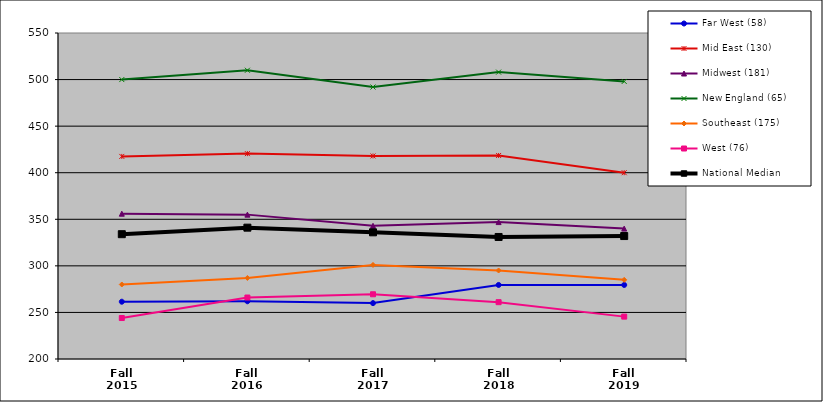
| Category | Far West (58) | Mid East (130) | Midwest (181) | New England (65) | Southeast (175) | West (76) | National Median |
|---|---|---|---|---|---|---|---|
| Fall 2015 | 261.5 | 417.5 | 356 | 500 | 280 | 244 | 334 |
| Fall 2016 | 262 | 420.5 | 355 | 510 | 287 | 266 | 341 |
| Fall 2017 | 260 | 418 | 343 | 492 | 301 | 269.5 | 336 |
| Fall 2018 | 279.5 | 418.5 | 347 | 508 | 295 | 261 | 331 |
| Fall 2019 | 279.5 | 400 | 340 | 498 | 285 | 245.5 | 332 |